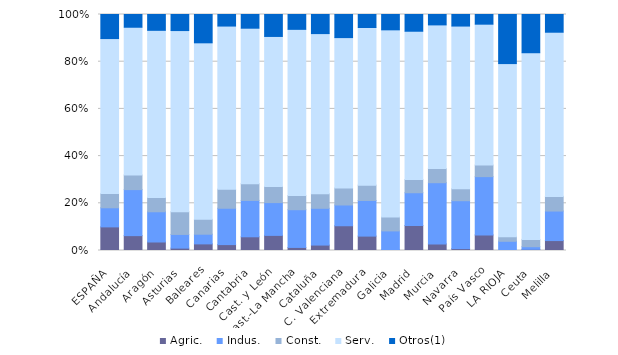
| Category | Agric. | Indus. | Const. | Serv. | Otros(1) |
|---|---|---|---|---|---|
| ESPAÑA | 10 | 8.1 | 6 | 65.7 | 10.2 |
| Andalucía | 6.3 | 19.5 | 6.2 | 62.6 | 5.4 |
| Aragón | 3.6 | 12.8 | 6 | 70.8 | 6.7 |
| Asturias | 1 | 5.8 | 9.6 | 76.7 | 6.8 |
| Baleares | 2.8 | 4.1 | 6.3 | 74.8 | 12 |
| Canarias | 2.5 | 15.4 | 8.1 | 69.1 | 4.9 |
| Cantabria | 5.8 | 15.4 | 7.1 | 65.8 | 5.8 |
| Cast. y León | 6.4 | 13.9 | 6.8 | 63.6 | 9.3 |
| Cast.-La Mancha | 1.3 | 16 | 6 | 70.5 | 6.3 |
| Cataluña | 2.3 | 15.6 | 6.2 | 67.9 | 8.1 |
| C. Valenciana | 10.5 | 8.8 | 7.2 | 63.8 | 9.8 |
| Extremadura | 6.1 | 15.1 | 6.5 | 66.8 | 5.5 |
| Galicia | 0.2 | 8.1 | 5.9 | 79.3 | 6.5 |
| Madrid | 10.6 | 13.9 | 5.6 | 62.9 | 7.1 |
| Murcia | 2.8 | 25.9 | 6 | 60.8 | 4.4 |
| Navarra | 0.8 | 20.3 | 5.1 | 68.9 | 4.9 |
| País Vasco | 6.6 | 24.7 | 4.9 | 59.7 | 4.1 |
| LA RIOJA | 0 | 3.9 | 1.9 | 73.4 | 20.8 |
| Ceuta | 0.5 | 1.1 | 3.1 | 79.1 | 16.2 |
| Melilla | 4.2 | 12.5 | 6.2 | 69.5 | 7.5 |